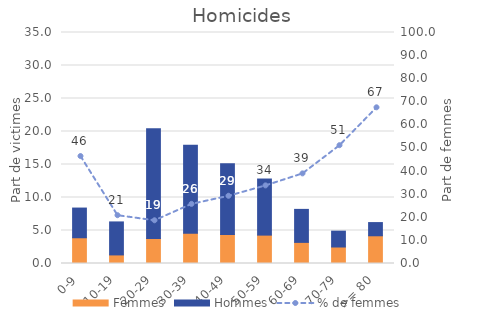
| Category | Femmes | Hommes |
|---|---|---|
| 0-9 | 3.9 | 4.5 |
| 10-19 | 1.3 | 5 |
| 20-29 | 3.8 | 16.6 |
| 30-39 | 4.6 | 13.3 |
| 40-49 | 4.4 | 10.7 |
| 50-59 | 4.3 | 8.5 |
| 60-69 | 3.2 | 5 |
| 70-79 | 2.5 | 2.4 |
| >= 80 | 4.2 | 2 |